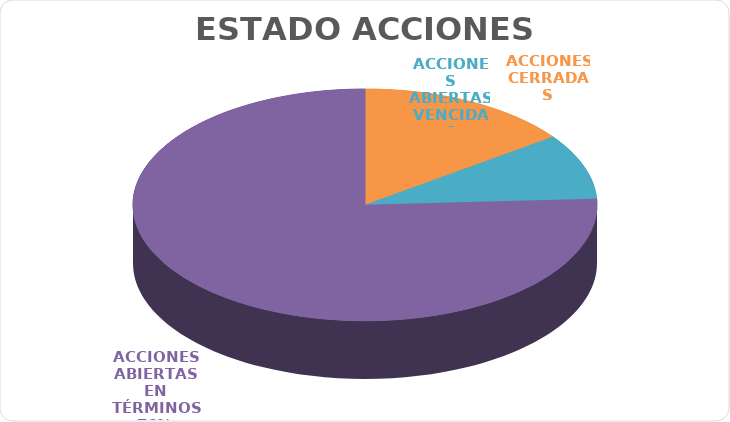
| Category | Series 0 |
|---|---|
| ACCIONES CERRADAS | 18 |
| ACCIONES ABIERTAS VENCIDAS | 11 |
| ACCIONES ABIERTAS EN TÉRMINOS | 91 |